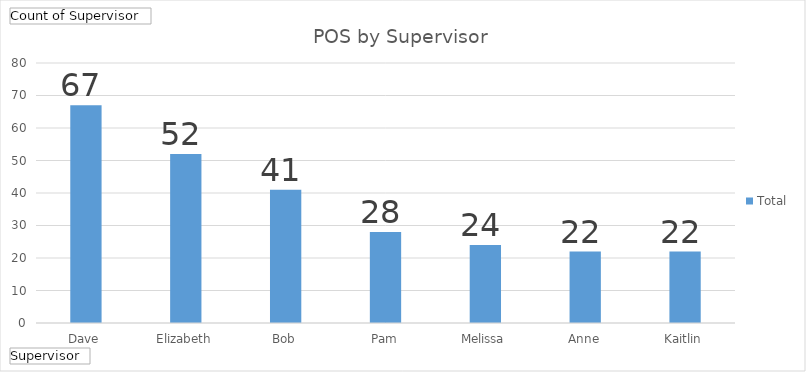
| Category | Total |
|---|---|
| Dave | 67 |
| Elizabeth | 52 |
| Bob | 41 |
| Pam | 28 |
| Melissa | 24 |
| Anne | 22 |
| Kaitlin | 22 |